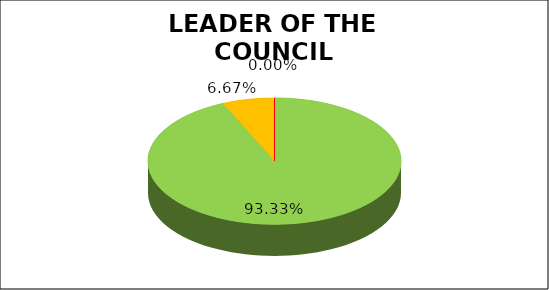
| Category | Q2 |
|---|---|
| Green | 0.933 |
| Amber | 0.067 |
| Red | 0 |